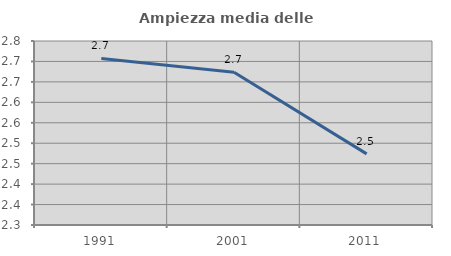
| Category | Ampiezza media delle famiglie |
|---|---|
| 1991.0 | 2.707 |
| 2001.0 | 2.674 |
| 2011.0 | 2.474 |